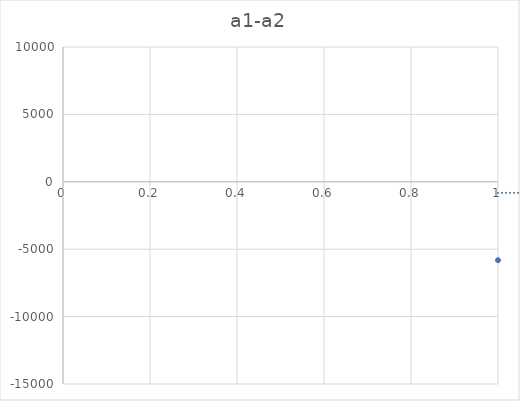
| Category | a1-a2 |
|---|---|
| 0 | -5814 |
| 1 | -144 |
| 2 | -152 |
| 3 | -5711 |
| 4 | 2166 |
| 5 | -1215 |
| 6 | -4148 |
| 7 | 819 |
| 8 | -7869 |
| 9 | -2157 |
| 10 | 298 |
| 11 | -1829 |
| 12 | -1309 |
| 13 | -6670 |
| 14 | 1163 |
| 15 | 1001 |
| 16 | -3149 |
| 17 | 294 |
| 18 | -5554 |
| 19 | -136 |
| 20 | 633 |
| 21 | -1696 |
| 22 | -933 |
| 23 | 417 |
| 24 | -5505 |
| 25 | 6 |
| 26 | -9800 |
| 27 | -4111 |
| 28 | -738 |
| 29 | 1725 |
| 30 | -3682 |
| 31 | 75 |
| 32 | 1071 |
| 33 | -520 |
| 34 | 3595 |
| 35 | -2906 |
| 36 | -1370 |
| 37 | 2928 |
| 38 | -1796 |
| 39 | -2349 |
| 40 | -4492 |
| 41 | -534 |
| 42 | -2374 |
| 43 | 3384 |
| 44 | -7138 |
| 45 | 1493 |
| 46 | -1169 |
| 47 | -1110 |
| 48 | -4396 |
| 49 | -5118 |
| 50 | -2422 |
| 51 | -986 |
| 52 | -1533 |
| 53 | 2186 |
| 54 | 3460 |
| 55 | -2607 |
| 56 | -520 |
| 57 | -1138 |
| 58 | -5370 |
| 59 | -3781 |
| 60 | -329 |
| 61 | -10223 |
| 62 | -2953 |
| 63 | 2648 |
| 64 | -3989 |
| 65 | 6063 |
| 66 | -3496 |
| 67 | -3298 |
| 68 | 3009 |
| 69 | -4574 |
| 70 | 3494 |
| 71 | 6284 |
| 72 | 630 |
| 73 | -771 |
| 74 | -5373 |
| 75 | 4284 |
| 76 | -8705 |
| 77 | -4807 |
| 78 | 664 |
| 79 | -363 |
| 80 | -439 |
| 81 | 1095 |
| 82 | -3187 |
| 83 | 1272 |
| 84 | -1499 |
| 85 | 153 |
| 86 | 6408 |
| 87 | 4411 |
| 88 | 125 |
| 89 | -2242 |
| 90 | 2934 |
| 91 | 24 |
| 92 | -2795 |
| 93 | -455 |
| 94 | -2668 |
| 95 | -1086 |
| 96 | -376 |
| 97 | -1486 |
| 98 | 1870 |
| 99 | 2910 |
| 100 | 2614 |
| 101 | 5072 |
| 102 | -654 |
| 103 | 384 |
| 104 | -4394 |
| 105 | 2130 |
| 106 | -591 |
| 107 | -3063 |
| 108 | -562 |
| 109 | 3529 |
| 110 | -363 |
| 111 | 1484 |
| 112 | 1605 |
| 113 | -4063 |
| 114 | 833 |
| 115 | 1388 |
| 116 | -169 |
| 117 | -1238 |
| 118 | -7695 |
| 119 | -3853 |
| 120 | 2486 |
| 121 | -1523 |
| 122 | 12 |
| 123 | 3466 |
| 124 | 490 |
| 125 | 1091 |
| 126 | -6106 |
| 127 | -2445 |
| 128 | -5899 |
| 129 | -5009 |
| 130 | 4534 |
| 131 | 1229 |
| 132 | -2088 |
| 133 | -4829 |
| 134 | 136 |
| 135 | 1633 |
| 136 | 7230 |
| 137 | -5398 |
| 138 | -1694 |
| 139 | -1412 |
| 140 | -1167 |
| 141 | -6040 |
| 142 | -4764 |
| 143 | -1218 |
| 144 | 3884 |
| 145 | 4167 |
| 146 | 533 |
| 147 | -1380 |
| 148 | -1273 |
| 149 | -466 |
| 150 | 667 |
| 151 | -2652 |
| 152 | -667 |
| 153 | 2427 |
| 154 | 13 |
| 155 | 3214 |
| 156 | 4454 |
| 157 | -2117 |
| 158 | 279 |
| 159 | 2171 |
| 160 | 5567 |
| 161 | -2696 |
| 162 | -689 |
| 163 | 855 |
| 164 | -1263 |
| 165 | 2572 |
| 166 | -277 |
| 167 | -5136 |
| 168 | -4173 |
| 169 | -2149 |
| 170 | -4071 |
| 171 | -4944 |
| 172 | 2980 |
| 173 | 549 |
| 174 | 1662 |
| 175 | -681 |
| 176 | -98 |
| 177 | -4519 |
| 178 | -6217 |
| 179 | 4164 |
| 180 | 2418 |
| 181 | -1545 |
| 182 | -2096 |
| 183 | -160 |
| 184 | 1340 |
| 185 | -1165 |
| 186 | -3415 |
| 187 | 519 |
| 188 | 3193 |
| 189 | 738 |
| 190 | 142 |
| 191 | -5010 |
| 192 | -3542 |
| 193 | -6214 |
| 194 | 1483 |
| 195 | -57 |
| 196 | -620 |
| 197 | -866 |
| 198 | 957 |
| 199 | 3658 |
| 200 | -5911 |
| 201 | -5521 |
| 202 | -563 |
| 203 | -862 |
| 204 | -5165 |
| 205 | 178 |
| 206 | -2475 |
| 207 | -1943 |
| 208 | 434 |
| 209 | 585 |
| 210 | -792 |
| 211 | -3512 |
| 212 | 875 |
| 213 | -865 |
| 214 | -3266 |
| 215 | 3300 |
| 216 | -719 |
| 217 | -2614 |
| 218 | -673 |
| 219 | 2854 |
| 220 | 1348 |
| 221 | 2553 |
| 222 | 2448 |
| 223 | -550 |
| 224 | 452 |
| 225 | -5754 |
| 226 | -1460 |
| 227 | -113 |
| 228 | -3136 |
| 229 | -8060 |
| 230 | 1018 |
| 231 | -1587 |
| 232 | -3434 |
| 233 | 2694 |
| 234 | 233 |
| 235 | -3554 |
| 236 | 311 |
| 237 | 1222 |
| 238 | -4308 |
| 239 | -1573 |
| 240 | -551 |
| 241 | -499 |
| 242 | 2030 |
| 243 | -7016 |
| 244 | -2975 |
| 245 | -4014 |
| 246 | 605 |
| 247 | 1804 |
| 248 | -992 |
| 249 | 1083 |
| 250 | 1508 |
| 251 | 471 |
| 252 | -3012 |
| 253 | -2067 |
| 254 | -983 |
| 255 | -10401 |
| 256 | -885 |
| 257 | -112 |
| 258 | -4548 |
| 259 | 1868 |
| 260 | -1298 |
| 261 | -2407 |
| 262 | 1229 |
| 263 | 1180 |
| 264 | 4837 |
| 265 | -1170 |
| 266 | 707 |
| 267 | -7096 |
| 268 | 2192 |
| 269 | -3882 |
| 270 | -2846 |
| 271 | -5040 |
| 272 | 2108 |
| 273 | 1833 |
| 274 | -1148 |
| 275 | 1701 |
| 276 | -4236 |
| 277 | -2052 |
| 278 | -2471 |
| 279 | -1613 |
| 280 | 233 |
| 281 | 740 |
| 282 | -2332 |
| 283 | -3654 |
| 284 | -837 |
| 285 | 106 |
| 286 | 2900 |
| 287 | -2941 |
| 288 | 276 |
| 289 | 1268 |
| 290 | -620 |
| 291 | -582 |
| 292 | -177 |
| 293 | -2087 |
| 294 | -2728 |
| 295 | -1163 |
| 296 | 1355 |
| 297 | -710 |
| 298 | -2204 |
| 299 | -5797 |
| 300 | -3121 |
| 301 | -3383 |
| 302 | -2733 |
| 303 | -3614 |
| 304 | 1083 |
| 305 | -819 |
| 306 | -7300 |
| 307 | -3233 |
| 308 | -2025 |
| 309 | 3180 |
| 310 | -1169 |
| 311 | -586 |
| 312 | 1242 |
| 313 | 2216 |
| 314 | -2472 |
| 315 | -8393 |
| 316 | 865 |
| 317 | 842 |
| 318 | -2699 |
| 319 | -3681 |
| 320 | 830 |
| 321 | -3700 |
| 322 | -8077 |
| 323 | -2359 |
| 324 | -6519 |
| 325 | -2416 |
| 326 | -4526 |
| 327 | 6550 |
| 328 | 4757 |
| 329 | -5303 |
| 330 | -1290 |
| 331 | -4712 |
| 332 | -463 |
| 333 | -1755 |
| 334 | -1477 |
| 335 | 1908 |
| 336 | -4196 |
| 337 | -7383 |
| 338 | -5345 |
| 339 | -10773 |
| 340 | -2917 |
| 341 | 658 |
| 342 | -895 |
| 343 | -1367 |
| 344 | -2309 |
| 345 | -4095 |
| 346 | 519 |
| 347 | 7390 |
| 348 | 2606 |
| 349 | -3582 |
| 350 | -2400 |